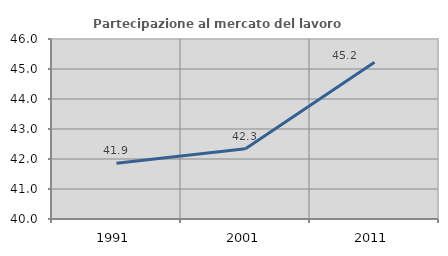
| Category | Partecipazione al mercato del lavoro  femminile |
|---|---|
| 1991.0 | 41.855 |
| 2001.0 | 42.342 |
| 2011.0 | 45.226 |